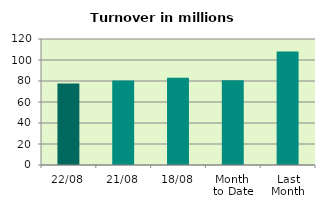
| Category | Series 0 |
|---|---|
| 22/08 | 77.722 |
| 21/08 | 80.582 |
| 18/08 | 83.152 |
| Month 
to Date | 80.74 |
| Last
Month | 108.022 |